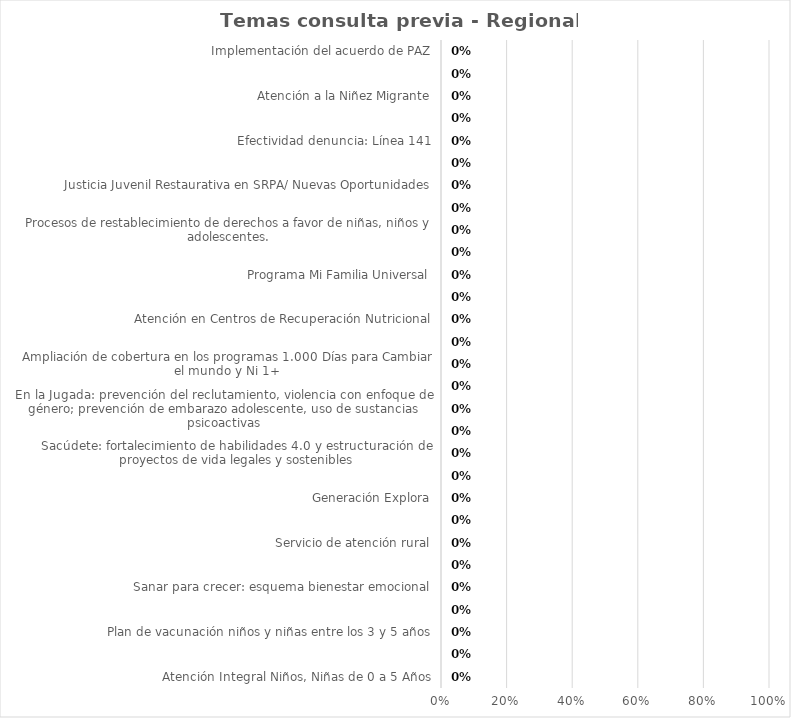
| Category | Temas consulta previa - Regional 0 / 0 |
|---|---|
| Atención Integral Niños, Niñas de 0 a 5 Años | 0 |
| Esquema pedagógico Mis Manos Te Enseñan | 0 |
| Plan de vacunación niños y niñas entre los 3 y 5 años | 0 |
| Contratación objetiva de operadores | 0 |
| Sanar para crecer: esquema bienestar emocional | 0 |
| Cualificación del talento humano: madres comunitarias y agentes educativos | 0 |
| Servicio de atención rural | 0 |
| Atención con Unidades de Búsqueda Activa | 0 |
| Generación Explora | 0 |
| Generaciones Étnicas con Bienestar | 0 |
| Sacúdete: fortalecimiento de habilidades 4.0 y estructuración de proyectos de vida legales y sostenibles | 0 |
| Hablar Lo Cura: Estrategia que promueve la salud mental | 0 |
| En la Jugada: prevención del reclutamiento, violencia con enfoque de género; prevención de embarazo adolescente, uso de sustancias psicoactivas | 0 |
| Entrega de canastas nutricionales | 0 |
| Ampliación de cobertura en los programas 1.000 Días para Cambiar el mundo y Ni 1+ | 0 |
| Contribución en las reducciones de muertes asociadas a desnutrición. | 0 |
| Atención en Centros de Recuperación Nutricional | 0 |
| Modalidad Katünaa Violencia al Interior del Hogar y Prevención de Riesgos | 0 |
| Programa Mi Familia Universal | 0 |
| Territorios Étnicos con Bienestar | 0 |
| Procesos de restablecimiento de derechos a favor de niñas, niños y adolescentes. | 0 |
| Proyecto Sueños | 0 |
| Justicia Juvenil Restaurativa en SRPA/ Nuevas Oportunidades | 0 |
| Adopciones | 0 |
| Efectividad denuncia: Línea 141 | 0 |
| Alianza contra las Violencias hacia niñas, niños y Adolescentes | 0 |
| Atención a la Niñez Migrante | 0 |
| Defensorías de familia | 0 |
| Implementación del acuerdo de PAZ | 0 |